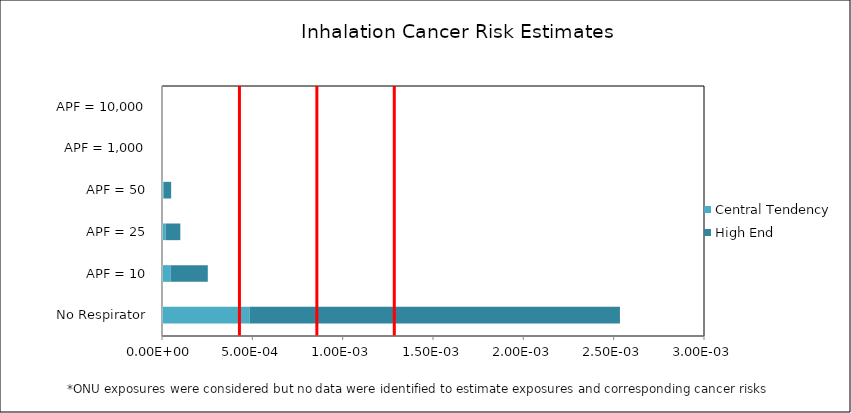
| Category | Central Tendency | High End |
|---|---|---|
| No Respirator | 0 | 0.002 |
| APF = 10 | 0 | 0 |
| APF = 25 | 0 | 0 |
| APF = 50 | 0 | 0 |
| APF = 1,000 | 0 | 0 |
| APF = 10,000 | 0 | 0 |